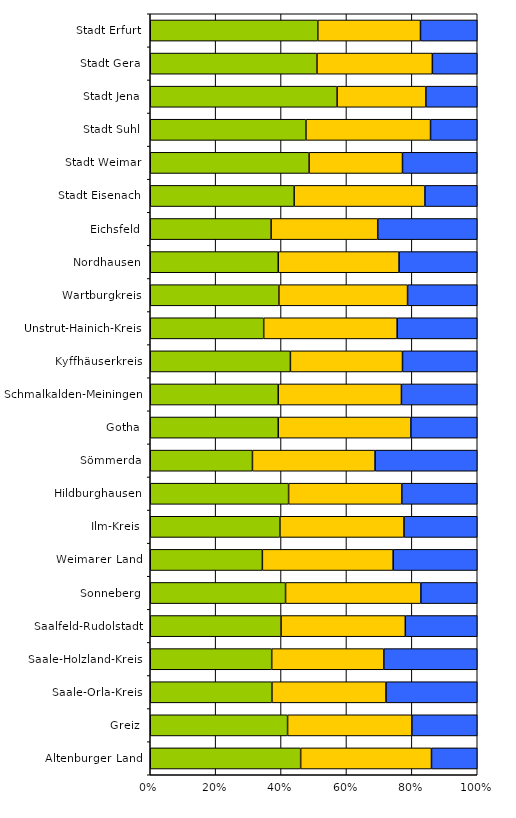
| Category | Series 0 | Series 1 | Series 2 |
|---|---|---|---|
| Altenburger Land | 23 | 20 | 7 |
| Greiz | 21 | 19 | 10 |
| Saale-Orla-Kreis | 16 | 15 | 12 |
| Saale-Holzland-Kreis | 13 | 12 | 10 |
| Saalfeld-Rudolstadt | 20 | 19 | 11 |
| Sonneberg | 12 | 12 | 5 |
| Weimarer Land | 12 | 14 | 9 |
| Ilm-Kreis | 23 | 22 | 13 |
| Hildburghausen | 11 | 9 | 6 |
| Sömmerda | 10 | 12 | 10 |
| Gotha | 27 | 28 | 14 |
| Schmalkalden-Meiningen | 27 | 26 | 16 |
| Kyffhäuserkreis | 15 | 12 | 8 |
| Unstrut-Hainich-Kreis | 17 | 20 | 12 |
| Wartburgkreis | 24 | 24 | 13 |
| Nordhausen | 18 | 17 | 11 |
| Eichsfeld | 17 | 15 | 14 |
| Stadt Eisenach | 11 | 10 | 4 |
| Stadt Weimar | 17 | 10 | 8 |
| Stadt Suhl | 10 | 8 | 3 |
| Stadt Jena | 40 | 19 | 11 |
| Stadt Gera | 26 | 18 | 7 |
| Stadt Erfurt | 62 | 38 | 21 |